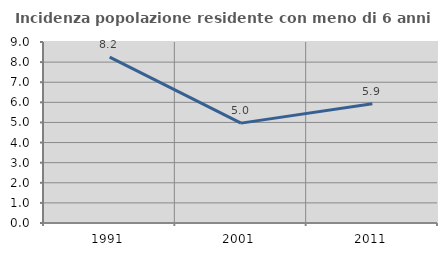
| Category | Incidenza popolazione residente con meno di 6 anni |
|---|---|
| 1991.0 | 8.25 |
| 2001.0 | 4.967 |
| 2011.0 | 5.927 |